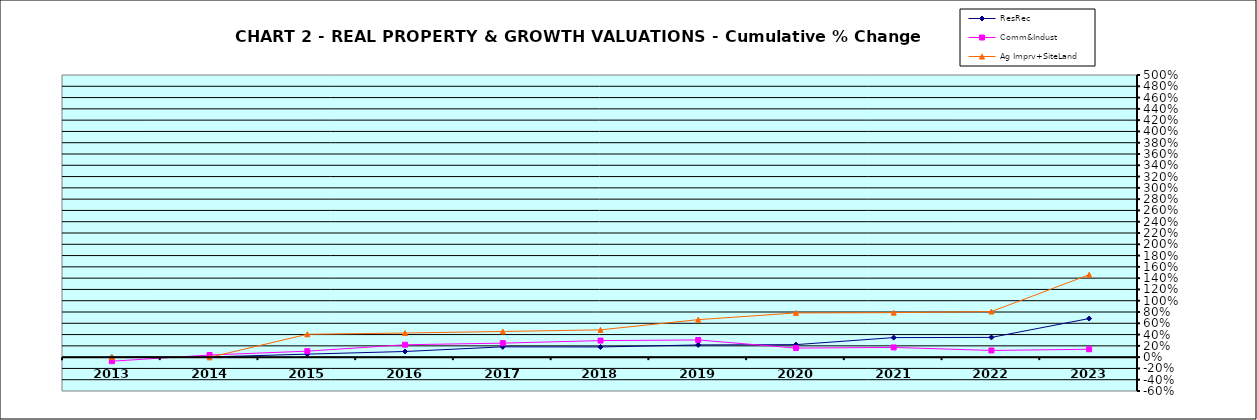
| Category | ResRec | Comm&Indust | Ag Imprv+SiteLand |
|---|---|---|---|
| 2013.0 | -0.002 | -0.072 | 0 |
| 2014.0 | 0.003 | 0.037 | -0.003 |
| 2015.0 | 0.053 | 0.106 | 0.405 |
| 2016.0 | 0.1 | 0.22 | 0.428 |
| 2017.0 | 0.183 | 0.248 | 0.455 |
| 2018.0 | 0.18 | 0.293 | 0.484 |
| 2019.0 | 0.216 | 0.304 | 0.664 |
| 2020.0 | 0.222 | 0.161 | 0.784 |
| 2021.0 | 0.346 | 0.172 | 0.789 |
| 2022.0 | 0.35 | 0.118 | 0.808 |
| 2023.0 | 0.684 | 0.14 | 1.461 |